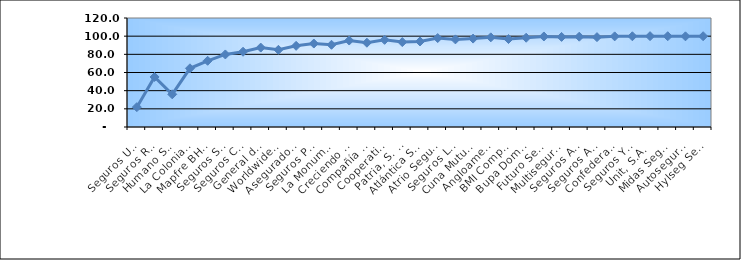
| Category | Series 0 |
|---|---|
| Seguros Universal, S. A. | 21.859 |
| Seguros Reservas, S. A. | 55.095 |
| Humano Seguros, S. A. | 35.981 |
| La Colonial, S. A., Compañia De Seguros | 64.607 |
| Mapfre BHD Compañía de Seguros | 72.89 |
| Seguros Sura, S.A. | 79.885 |
| Seguros Crecer, S. A. | 82.856 |
| General de Seguros, S. A. | 87.431 |
| Worldwide Seguros, S. A. | 84.963 |
| Aseguradora Agropecuaria Dominicana, S. A. | 89.345 |
| Seguros Pepín, S. A. | 91.884 |
| La Monumental de Seguros, S. A. | 90.53 |
| Creciendo Seguros | 95.206 |
| Compañía Dominicana de Seguros, C. por A. | 92.774 |
| Cooperativa Nacional De Seguros, Inc  | 95.945 |
| Patria, S. A., Compañía de Seguros | 93.476 |
| Atlántica Seguros, S. A. | 94.169 |
| Atrio Seguros S. A. | 97.919 |
| Seguros La Internacional, S. A. | 96.458 |
| Cuna Mutual Insurance Society Dominicana | 97.342 |
| Angloamericana de Seguros, S. A. | 98.705 |
| BMI Compañía de Seguros, S. A. | 96.859 |
| Bupa Dominicana, S. A. | 98.287 |
| Futuro Seguros | 99.672 |
| Multiseguros Su, S.A. | 99.185 |
| Seguros Ademi, S.A. | 99.424 |
| Seguros APS, S.R.L. | 98.936 |
| Confederación del Canadá Dominicana, S. A. | 99.78 |
| Seguros Yunen, S.A. | 99.887 |
| Unit, S.A. | 100 |
| Midas Seguros, S.A. | 99.936 |
| Autoseguro, S. A. | 99.825 |
| Hylseg Seguros S.A | 99.944 |